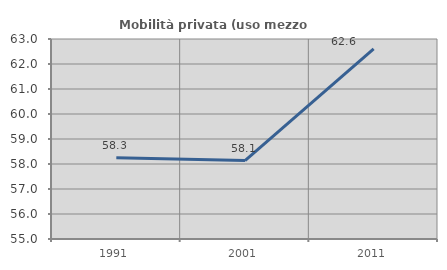
| Category | Mobilità privata (uso mezzo privato) |
|---|---|
| 1991.0 | 58.252 |
| 2001.0 | 58.14 |
| 2011.0 | 62.602 |